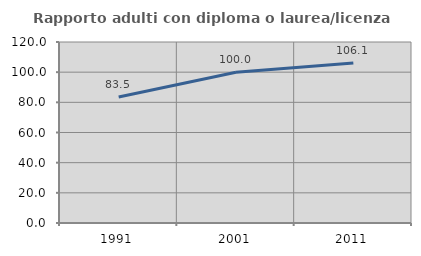
| Category | Rapporto adulti con diploma o laurea/licenza media  |
|---|---|
| 1991.0 | 83.495 |
| 2001.0 | 100 |
| 2011.0 | 106.098 |